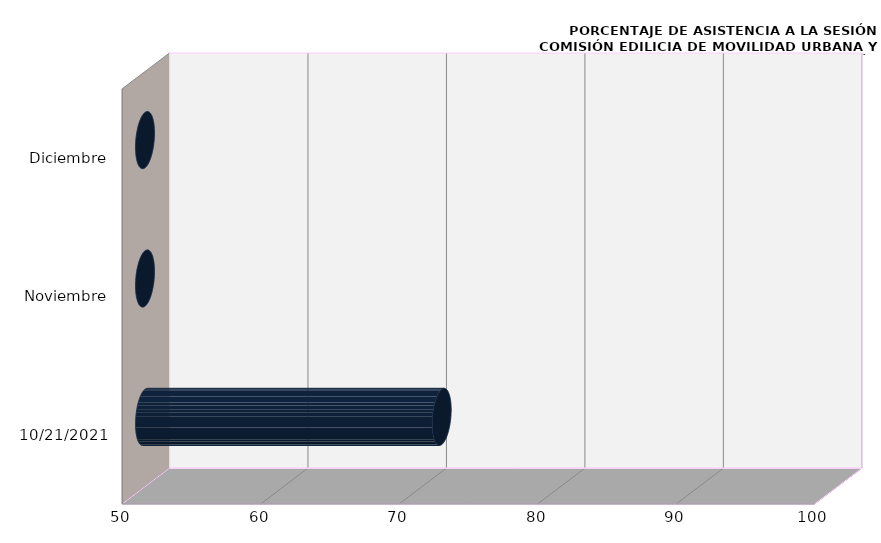
| Category | Series 0 |
|---|---|
| 21/10/2021 | 71.429 |
| Noviembre | 0 |
| Diciembre | 0 |